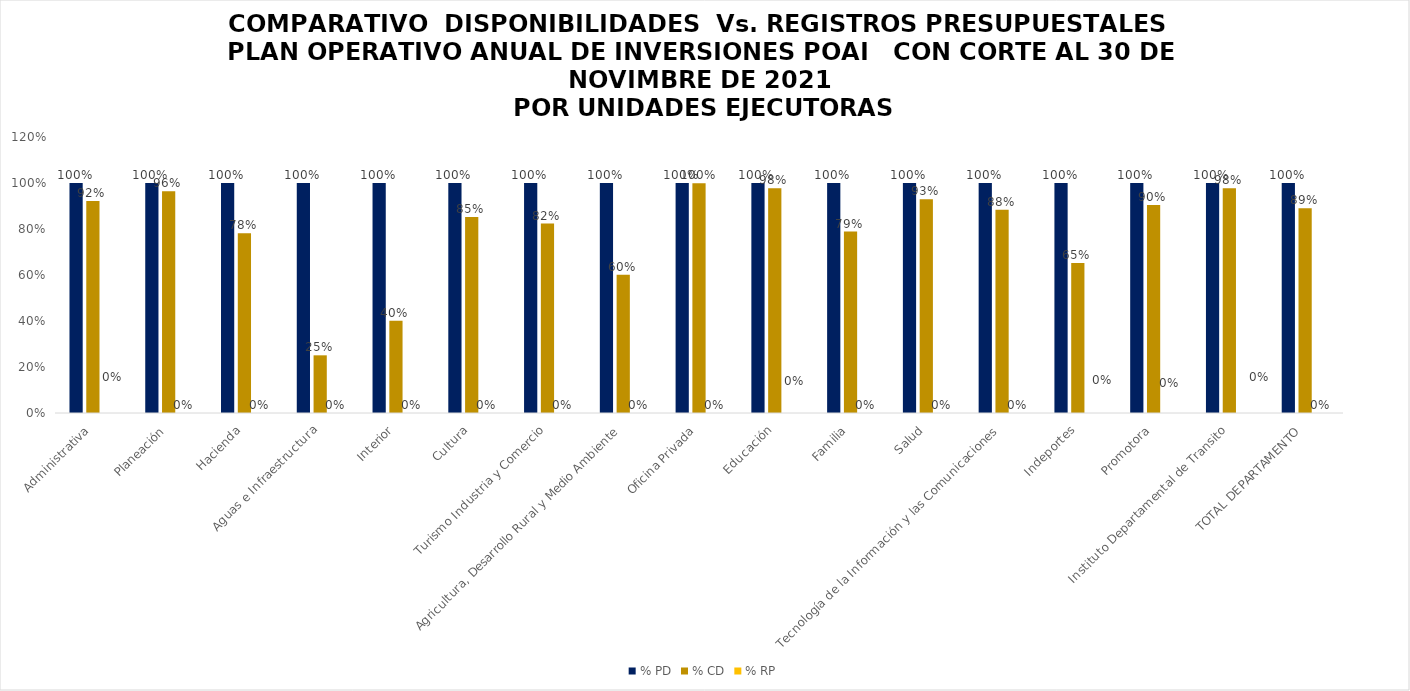
| Category | % PD | % CD | % RP |
|---|---|---|---|
| Administrativa | 1 | 0.921 | 0 |
| Planeación | 1 | 0.964 | 0 |
| Hacienda | 1 | 0.781 | 0 |
| Aguas e Infraestructura | 1 | 0.251 | 0 |
| Interior | 1 | 0.401 | 0 |
| Cultura | 1 | 0.852 | 0 |
| Turismo Industria y Comercio | 1 | 0.824 | 0 |
| Agricultura, Desarrollo Rural y Medio Ambiente | 1 | 0.602 | 0 |
| Oficina Privada | 1 | 0.999 | 0 |
| Educación | 1 | 0.977 | 0 |
| Familia | 1 | 0.789 | 0 |
| Salud | 1 | 0.929 | 0 |
| Tecnología de la Información y las Comunicaciones | 1 | 0.884 | 0 |
| Indeportes | 1 | 0.653 | 0 |
| Promotora | 1 | 0.904 | 0 |
| Instituto Departamental de Transito | 1 | 0.977 | 0 |
| TOTAL DEPARTAMENTO | 1 | 0.89 | 0 |